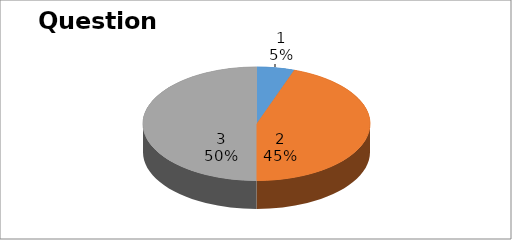
| Category | Series 0 |
|---|---|
| 0 | 3 |
| 1 | 25 |
| 2 | 28 |